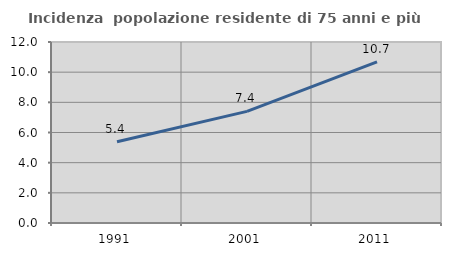
| Category | Incidenza  popolazione residente di 75 anni e più |
|---|---|
| 1991.0 | 5.388 |
| 2001.0 | 7.402 |
| 2011.0 | 10.68 |